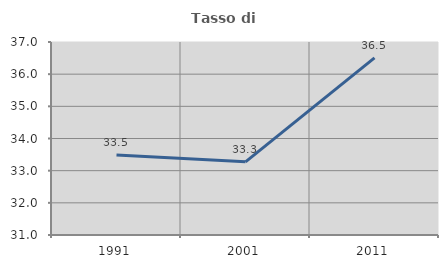
| Category | Tasso di occupazione   |
|---|---|
| 1991.0 | 33.488 |
| 2001.0 | 33.274 |
| 2011.0 | 36.505 |